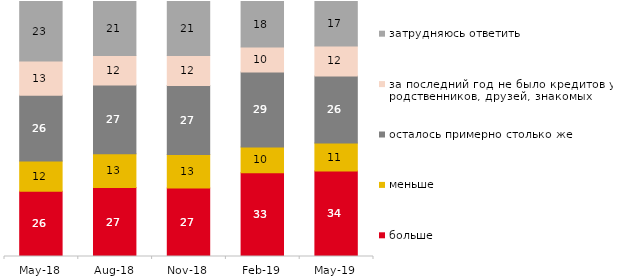
| Category | больше | меньше | осталось примерно столько же | за последний год не было кредитов у родственников, друзей, знакомых | затрудняюсь ответить |
|---|---|---|---|---|---|
| 2018-05-01 | 25.55 | 11.9 | 25.75 | 13.45 | 23.35 |
| 2018-08-01 | 27.05 | 13.2 | 27 | 11.6 | 21.15 |
| 2018-11-01 | 26.896 | 13.074 | 27.096 | 11.776 | 21.158 |
| 2019-02-01 | 32.8 | 10.1 | 29.45 | 9.8 | 17.85 |
| 2019-05-01 | 33.531 | 10.946 | 26.35 | 11.689 | 17.484 |